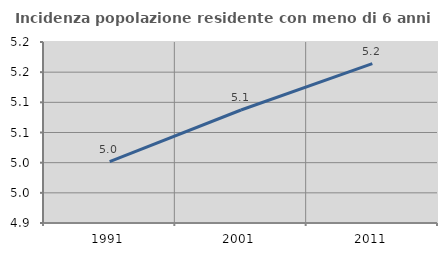
| Category | Incidenza popolazione residente con meno di 6 anni |
|---|---|
| 1991.0 | 5.002 |
| 2001.0 | 5.087 |
| 2011.0 | 5.164 |